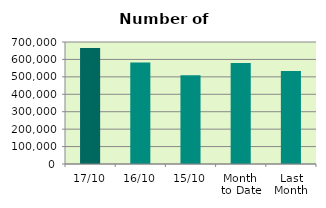
| Category | Series 0 |
|---|---|
| 17/10 | 665164 |
| 16/10 | 582912 |
| 15/10 | 509676 |
| Month 
to Date | 580178.923 |
| Last
Month | 533338.9 |